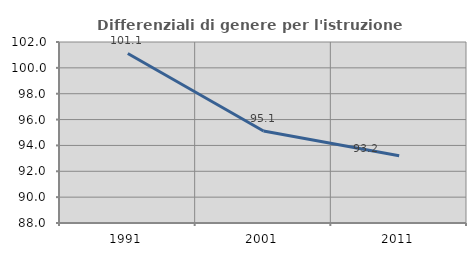
| Category | Differenziali di genere per l'istruzione superiore |
|---|---|
| 1991.0 | 101.115 |
| 2001.0 | 95.116 |
| 2011.0 | 93.199 |